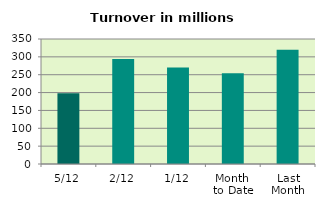
| Category | Series 0 |
|---|---|
| 5/12 | 198.051 |
| 2/12 | 294.234 |
| 1/12 | 270.109 |
| Month 
to Date | 254.131 |
| Last
Month | 319.611 |